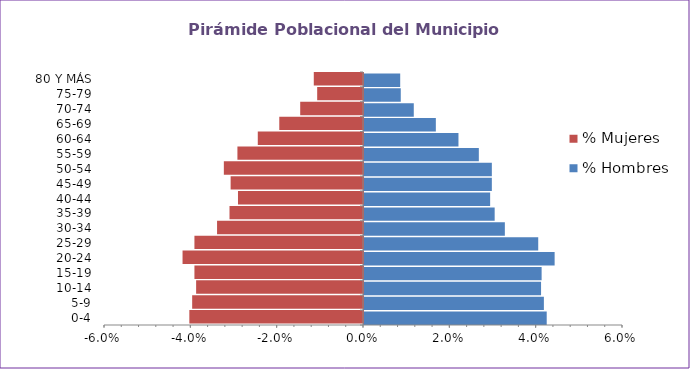
| Category | % Hombres | % Mujeres |
|---|---|---|
| 0-4 | 0.042 | -0.04 |
| 5-9 | 0.042 | -0.04 |
| 10-14 | 0.041 | -0.039 |
| 15-19 | 0.041 | -0.039 |
| 20-24 | 0.044 | -0.042 |
| 25-29 | 0.04 | -0.039 |
| 30-34 | 0.033 | -0.034 |
| 35-39 | 0.03 | -0.031 |
| 40-44 | 0.029 | -0.029 |
| 45-49 | 0.03 | -0.031 |
| 50-54 | 0.03 | -0.032 |
| 55-59 | 0.027 | -0.029 |
| 60-64 | 0.022 | -0.024 |
| 65-69 | 0.017 | -0.019 |
| 70-74 | 0.012 | -0.015 |
| 75-79 | 0.009 | -0.011 |
| 80 Y MÁS | 0.008 | -0.011 |